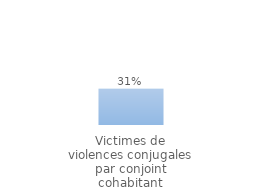
| Category | au moins une démarche |
|---|---|
| Victimes de violences conjugales par conjoint cohabitant | 0.31 |